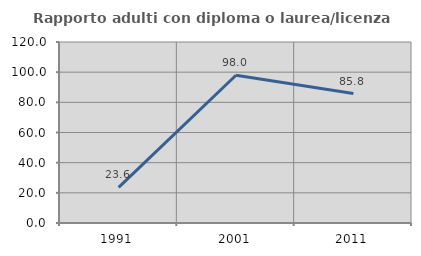
| Category | Rapporto adulti con diploma o laurea/licenza media  |
|---|---|
| 1991.0 | 23.605 |
| 2001.0 | 97.959 |
| 2011.0 | 85.804 |